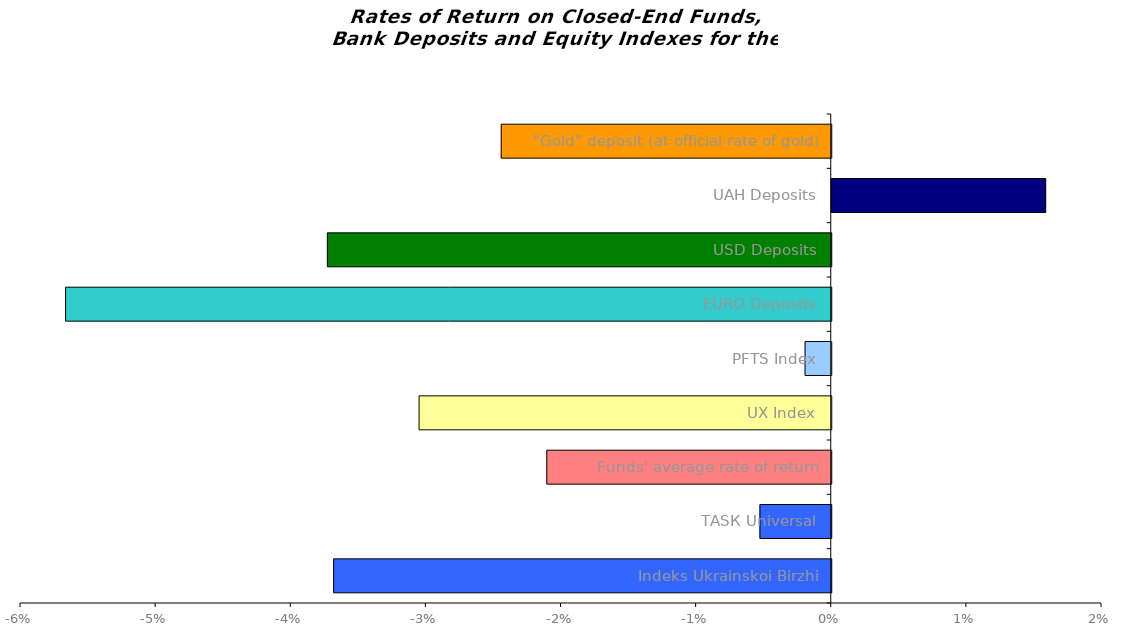
| Category | Series 0 |
|---|---|
| Іndeks Ukrainskoi Birzhi | -0.037 |
| ТАSК Universal | -0.005 |
| Funds' average rate of return | -0.021 |
| UX Index | -0.031 |
| PFTS Index | -0.002 |
| EURO Deposits | -0.057 |
| USD Deposits | -0.037 |
| UAH Deposits | 0.016 |
| "Gold" deposit (at official rate of gold) | -0.024 |